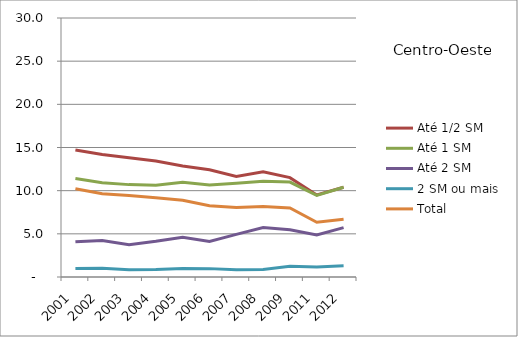
| Category | Até 1/2 SM | Até 1 SM | Até 2 SM | 2 SM ou mais | Total |
|---|---|---|---|---|---|
| 2001.0 | 14.72 | 11.4 | 4.07 | 0.99 | 10.22 |
| 2002.0 | 14.19 | 10.93 | 4.23 | 1 | 9.64 |
| 2003.0 | 13.82 | 10.7 | 3.73 | 0.85 | 9.45 |
| 2004.0 | 13.43 | 10.64 | 4.13 | 0.86 | 9.18 |
| 2005.0 | 12.86 | 10.96 | 4.61 | 0.99 | 8.9 |
| 2006.0 | 12.43 | 10.67 | 4.11 | 0.97 | 8.26 |
| 2007.0 | 11.64 | 10.87 | 4.94 | 0.84 | 8.04 |
| 2008.0 | 12.2 | 11.09 | 5.74 | 0.87 | 8.18 |
| 2009.0 | 11.51 | 11 | 5.46 | 1.25 | 7.99 |
| 2011.0 | 9.51 | 9.46 | 4.86 | 1.16 | 6.34 |
| 2012.0 | 10.39 | 10.39 | 5.72 | 1.29 | 6.7 |